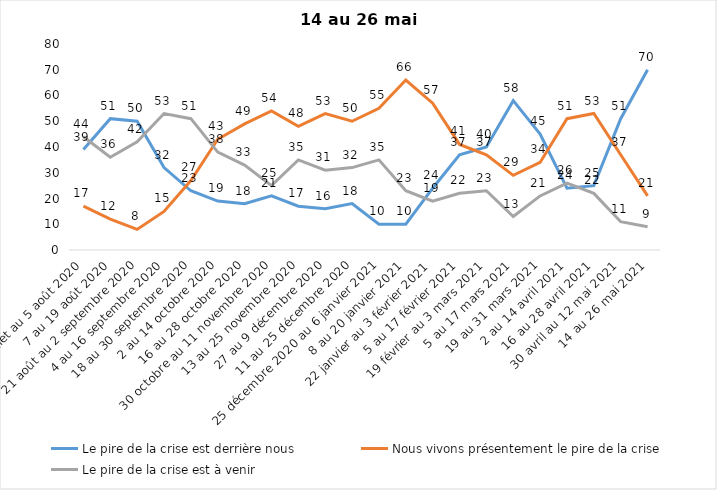
| Category | Le pire de la crise est derrière nous | Nous vivons présentement le pire de la crise | Le pire de la crise est à venir |
|---|---|---|---|
| 24 juillet au 5 août 2020 | 39 | 17 | 44 |
| 7 au 19 août 2020 | 51 | 12 | 36 |
| 21 août au 2 septembre 2020 | 50 | 8 | 42 |
| 4 au 16 septembre 2020 | 32 | 15 | 53 |
| 18 au 30 septembre 2020 | 23 | 27 | 51 |
| 2 au 14 octobre 2020 | 19 | 43 | 38 |
| 16 au 28 octobre 2020 | 18 | 49 | 33 |
| 30 octobre au 11 novembre 2020 | 21 | 54 | 25 |
| 13 au 25 novembre 2020 | 17 | 48 | 35 |
| 27 au 9 décembre 2020 | 16 | 53 | 31 |
| 11 au 25 décembre 2020 | 18 | 50 | 32 |
| 25 décembre 2020 au 6 janvier 2021 | 10 | 55 | 35 |
| 8 au 20 janvier 2021 | 10 | 66 | 23 |
| 22 janvier au 3 février 2021 | 24 | 57 | 19 |
| 5 au 17 février 2021 | 37 | 41 | 22 |
| 19 février au 3 mars 2021 | 40 | 37 | 23 |
| 5 au 17 mars 2021 | 58 | 29 | 13 |
| 19 au 31 mars 2021 | 45 | 34 | 21 |
| 2 au 14 avril 2021 | 24 | 51 | 26 |
| 16 au 28 avril 2021 | 25 | 53 | 22 |
| 30 avril au 12 mai 2021 | 51 | 37 | 11 |
| 14 au 26 mai 2021 | 70 | 21 | 9 |